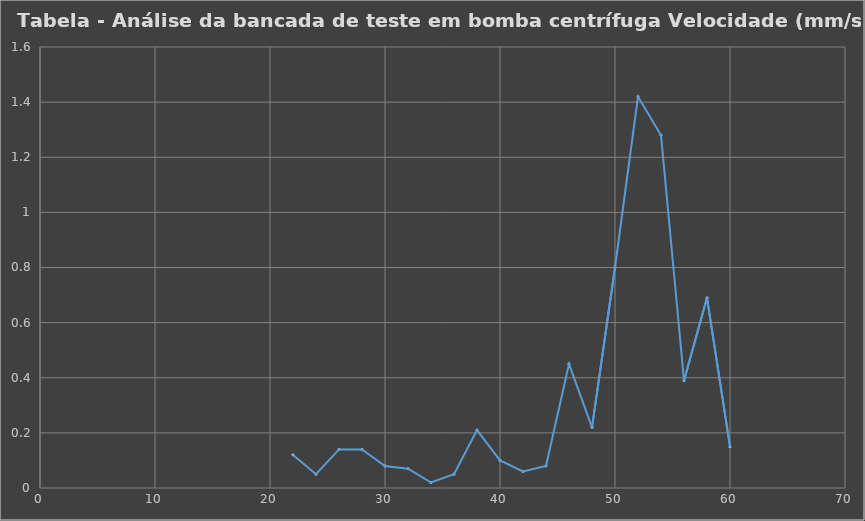
| Category | Tabela - Análise da bancada de teste em bomba centrífuga |
|---|---|
| 22.0 | 0.12 |
| 24.0 | 0.05 |
| 26.0 | 0.14 |
| 28.0 | 0.14 |
| 30.0 | 0.08 |
| 32.0 | 0.07 |
| 34.0 | 0.02 |
| 36.0 | 0.05 |
| 38.0 | 0.21 |
| 40.0 | 0.1 |
| 42.0 | 0.06 |
| 44.0 | 0.08 |
| 46.0 | 0.45 |
| 48.0 | 0.22 |
| 50.0 | 0.8 |
| 52.0 | 1.42 |
| 54.0 | 1.28 |
| 56.0 | 0.39 |
| 58.0 | 0.69 |
| 60.0 | 0.15 |